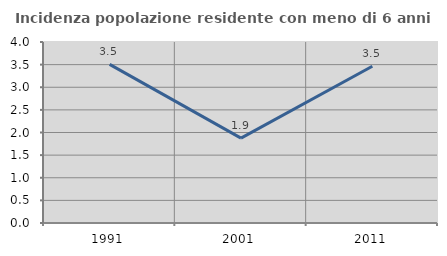
| Category | Incidenza popolazione residente con meno di 6 anni |
|---|---|
| 1991.0 | 3.506 |
| 2001.0 | 1.875 |
| 2011.0 | 3.464 |